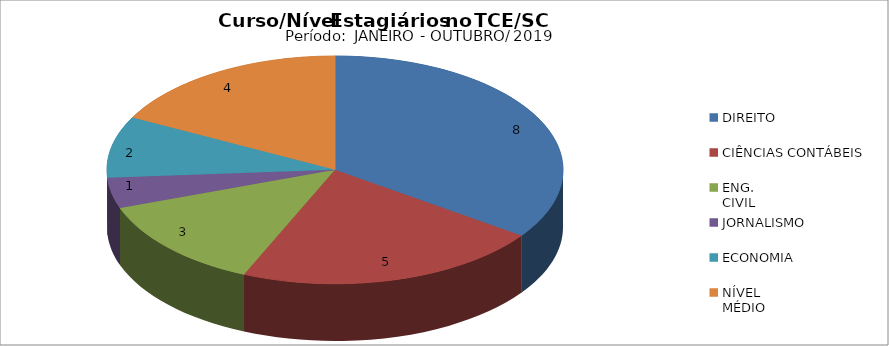
| Category | Series 0 |
|---|---|
| DIREITO | 8 |
| CIÊNCIAS CONTÁBEIS | 5 |
| ENG.
CIVIL | 3 |
| JORNALISMO  | 1 |
| ECONOMIA | 2 |
| NÍVEL
MÉDIO  | 4 |